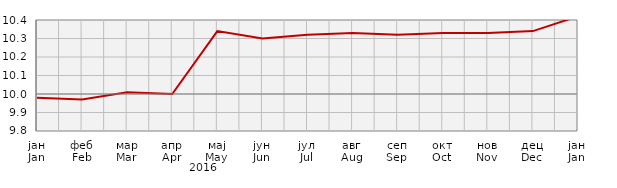
| Category | Индекси цијена произвођача
Producer price indices |
|---|---|
| јан
Jan | 99.8 |
| феб
Feb | 99.7 |
| мар
Mar | 100.1 |
| апр
Apr | 100 |
| мај
May | 103.4 |
| јун
Jun | 103 |
| јул
Jul | 103.2 |
| авг
Aug | 103.3 |
| сеп
Sep | 103.2 |
| окт
Oct | 103.3 |
| нов
Nov | 103.3 |
| дец
Dec | 103.4 |
| јан
Jan | 104.2 |